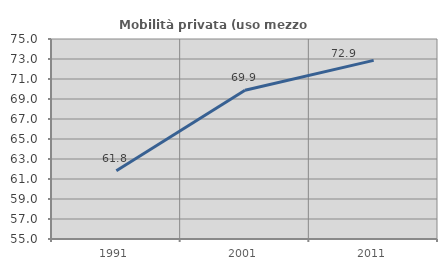
| Category | Mobilità privata (uso mezzo privato) |
|---|---|
| 1991.0 | 61.817 |
| 2001.0 | 69.88 |
| 2011.0 | 72.864 |